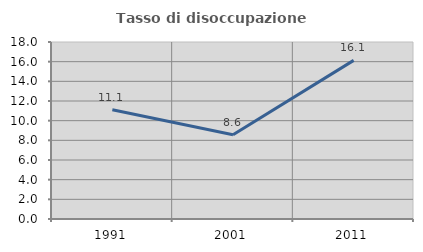
| Category | Tasso di disoccupazione giovanile  |
|---|---|
| 1991.0 | 11.111 |
| 2001.0 | 8.571 |
| 2011.0 | 16.129 |